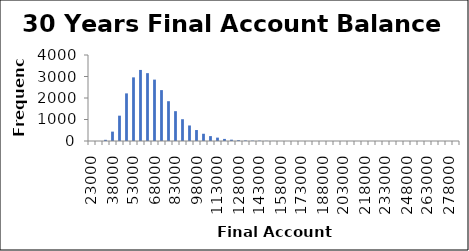
| Category | Frequency |
|---|---|
| 23000.0 | 0 |
| 28000.0 | 1 |
| 33000.0 | 55 |
| 38000.0 | 436 |
| 43000.0 | 1178 |
| 48000.0 | 2215 |
| 53000.0 | 2960 |
| 58000.0 | 3305 |
| 63000.0 | 3156 |
| 68000.0 | 2855 |
| 73000.0 | 2367 |
| 78000.0 | 1851 |
| 83000.0 | 1387 |
| 88000.0 | 1013 |
| 93000.0 | 722 |
| 98000.0 | 510 |
| 103000.0 | 337 |
| 108000.0 | 227 |
| 113000.0 | 157 |
| 118000.0 | 97 |
| 123000.0 | 62 |
| 128000.0 | 39 |
| 133000.0 | 25 |
| 138000.0 | 16 |
| 143000.0 | 15 |
| 148000.0 | 7 |
| 153000.0 | 3 |
| 158000.0 | 1 |
| 163000.0 | 1 |
| 168000.0 | 1 |
| 173000.0 | 1 |
| 178000.0 | 0 |
| 183000.0 | 0 |
| 188000.0 | 0 |
| 193000.0 | 0 |
| 198000.0 | 0 |
| 203000.0 | 0 |
| 208000.0 | 0 |
| 213000.0 | 0 |
| 218000.0 | 0 |
| 223000.0 | 0 |
| 228000.0 | 0 |
| 233000.0 | 0 |
| 238000.0 | 0 |
| 243000.0 | 0 |
| 248000.0 | 0 |
| 253000.0 | 0 |
| 258000.0 | 0 |
| 263000.0 | 0 |
| 268000.0 | 0 |
| 273000.0 | 0 |
| 278000.0 | 0 |
| More | 0 |